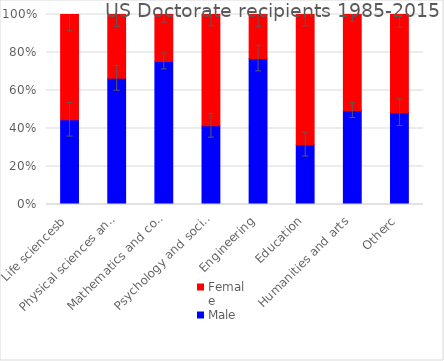
| Category | Male | Female |
|---|---|---|
| Life sciencesb | 0.446 | 0.554 |
| Physical sciences and earth sciences | 0.664 | 0.336 |
| Mathematics and computer sciences | 0.753 | 0.247 |
| Psychology and social sciences | 0.414 | 0.586 |
| Engineering | 0.768 | 0.232 |
| Education | 0.315 | 0.685 |
| Humanities and arts | 0.494 | 0.506 |
| Otherc | 0.483 | 0.517 |